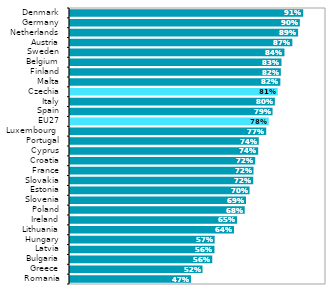
| Category | Series 1 |
|---|---|
| Romania | 0.473 |
| Greece | 0.518 |
| Bulgaria | 0.556 |
| Latvia | 0.564 |
| Hungary | 0.565 |
| Lithuania | 0.641 |
| Ireland | 0.653 |
| Poland | 0.683 |
| Slovenia | 0.688 |
| Estonia | 0.701 |
| Slovakia | 0.716 |
| France | 0.717 |
| Croatia | 0.724 |
| Cyprus | 0.735 |
| Portugal | 0.737 |
| Luxembourg  | 0.766 |
| EU27 | 0.776 |
| Spain | 0.791 |
| Italy | 0.8 |
| Czechia | 0.812 |
| Malta | 0.822 |
| Finland | 0.824 |
| Belgium | 0.826 |
| Sweden | 0.838 |
| Austria | 0.869 |
| Netherlands | 0.891 |
| Germany | 0.898 |
| Denmark | 0.911 |